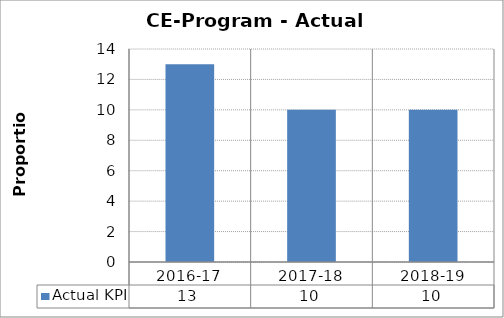
| Category | Actual KPI |
|---|---|
| 2016-17 | 13 |
| 2017-18 | 10 |
| 2018-19 | 10 |